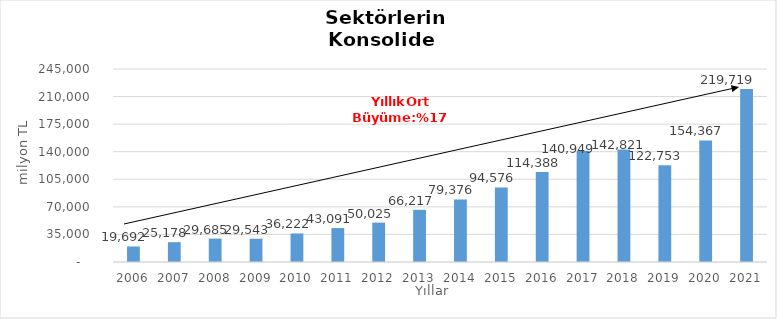
| Category | Toplam |
|---|---|
| 2006.0 | 19691.807 |
| 2007.0 | 25178.471 |
| 2008.0 | 29685 |
| 2009.0 | 29543.192 |
| 2010.0 | 36222.019 |
| 2011.0 | 43090.622 |
| 2012.0 | 50025.409 |
| 2013.0 | 66217.364 |
| 2014.0 | 79376 |
| 2015.0 | 94576 |
| 2016.0 | 114388 |
| 2017.0 | 140949 |
| 2018.0 | 142821 |
| 2019.0 | 122753 |
| 2020.0 | 154367 |
| 2021.0 | 219719 |